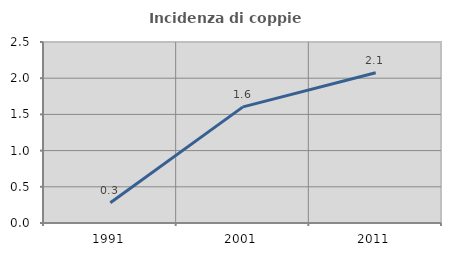
| Category | Incidenza di coppie miste |
|---|---|
| 1991.0 | 0.28 |
| 2001.0 | 1.604 |
| 2011.0 | 2.076 |